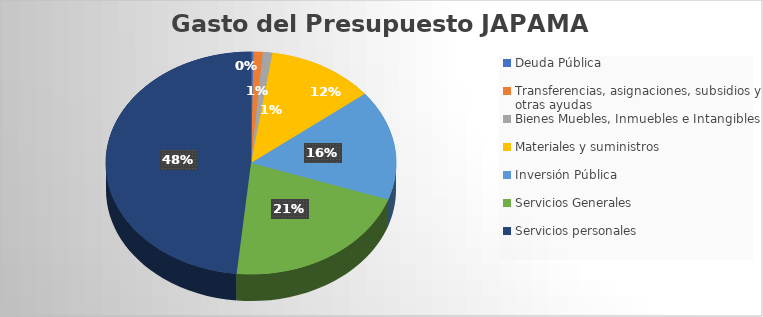
| Category | Monto |
|---|---|
| Deuda Pública | 1857476.5 |
| Transferencias, asignaciones, subsidios y otras ayudas | 6765371.26 |
| Bienes Muebles, Inmuebles e Intangibles | 7062980.06 |
| Materiales y suministros  | 79708223.04 |
| Inversión Pública | 106515092.68 |
| Servicios Generales | 141213394.23 |
| Servicios personales | 322112307.69 |